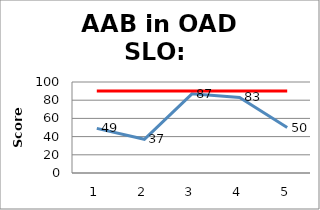
| Category | Avg Scores | Goal |
|---|---|---|
| 0 | 49 | 90 |
| 1 | 37 | 90 |
| 2 | 87 | 90 |
| 3 | 83 | 90 |
| 4 | 50 | 90 |